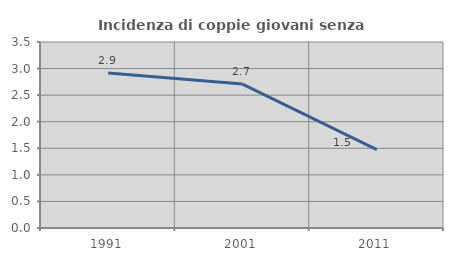
| Category | Incidenza di coppie giovani senza figli |
|---|---|
| 1991.0 | 2.915 |
| 2001.0 | 2.708 |
| 2011.0 | 1.476 |